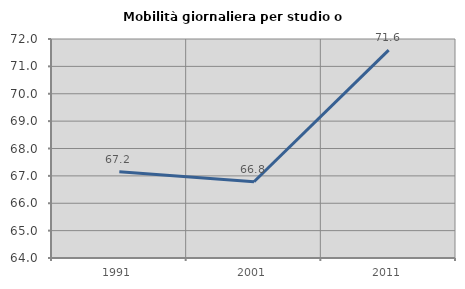
| Category | Mobilità giornaliera per studio o lavoro |
|---|---|
| 1991.0 | 67.15 |
| 2001.0 | 66.786 |
| 2011.0 | 71.591 |